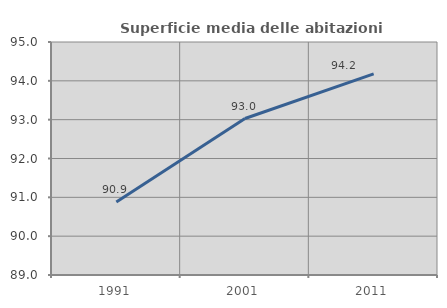
| Category | Superficie media delle abitazioni occupate |
|---|---|
| 1991.0 | 90.881 |
| 2001.0 | 93.03 |
| 2011.0 | 94.181 |